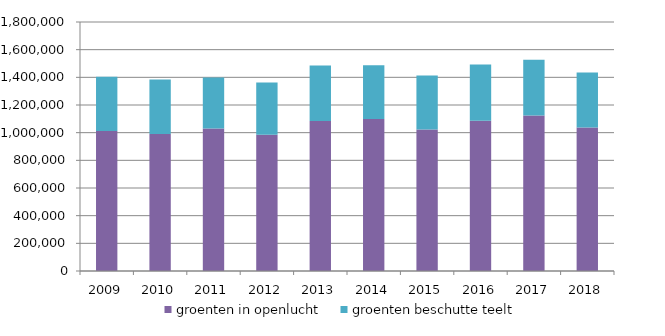
| Category | groenten in openlucht | groenten beschutte teelt |
|---|---|---|
| 2009.0 | 1011425 | 392758 |
| 2010.0 | 990248 | 394901 |
| 2011.0 | 1029868 | 368436 |
| 2012.0 | 985763 | 376410 |
| 2013.0 | 1084554 | 401161 |
| 2014.0 | 1099539 | 388201 |
| 2015.0 | 1022110 | 391524 |
| 2016.0 | 1085750 | 406593 |
| 2017.0 | 1124918 | 402976 |
| 2018.0 | 1037969 | 396080 |